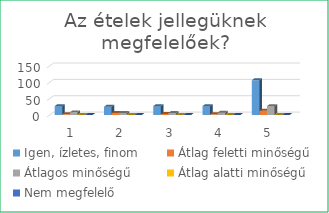
| Category | Igen, ízletes, finom | Átlag feletti minőségű | Átlagos minőségű | Átlag alatti minőségű | Nem megfelelő |
|---|---|---|---|---|---|
| 0 | 27 | 2 | 8 | 0 | 0 |
| 1 | 25 | 6 | 6 | 0 | 0 |
| 2 | 27 | 3 | 6 | 0 | 0 |
| 3 | 27 | 2 | 7 | 0 | 0 |
| 4 | 106 | 13 | 27 | 0 | 0 |